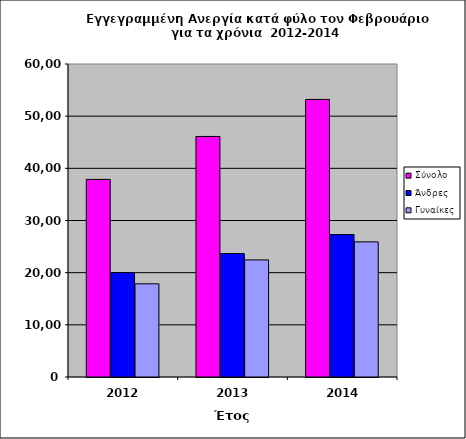
| Category | Σύνολο | Άνδρες  | Γυναίκες  |
|---|---|---|---|
| 2012.0 | 37874 | 20016 | 17858 |
| 2013.0 | 46109 | 23664 | 22445 |
| 2014.0 | 53204 | 27296 | 25908 |